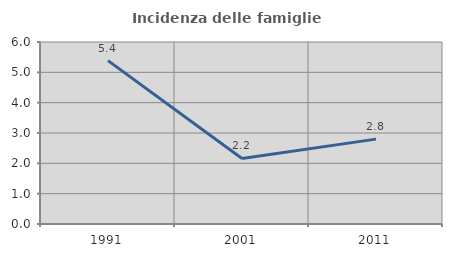
| Category | Incidenza delle famiglie numerose |
|---|---|
| 1991.0 | 5.387 |
| 2001.0 | 2.162 |
| 2011.0 | 2.798 |